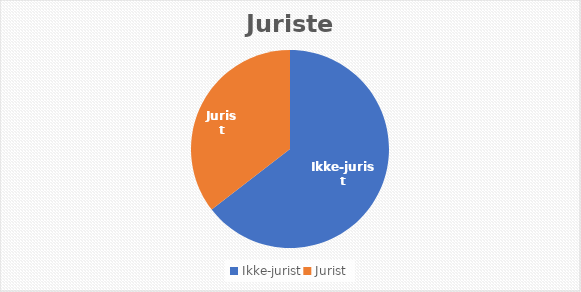
| Category | Series 0 |
|---|---|
| Ikke-jurist | 302 |
| Jurist | 166 |